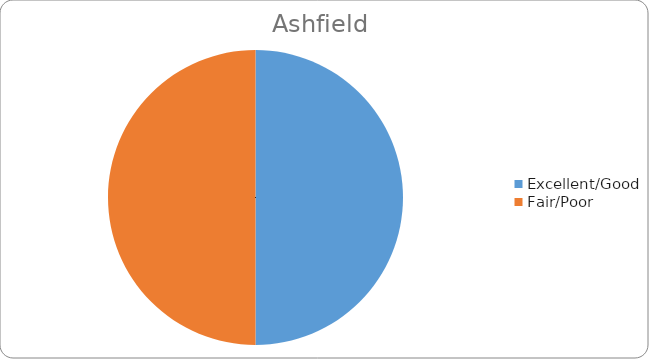
| Category | Series 0 |
|---|---|
| Excellent/Good | 50 |
| Fair/Poor | 50 |